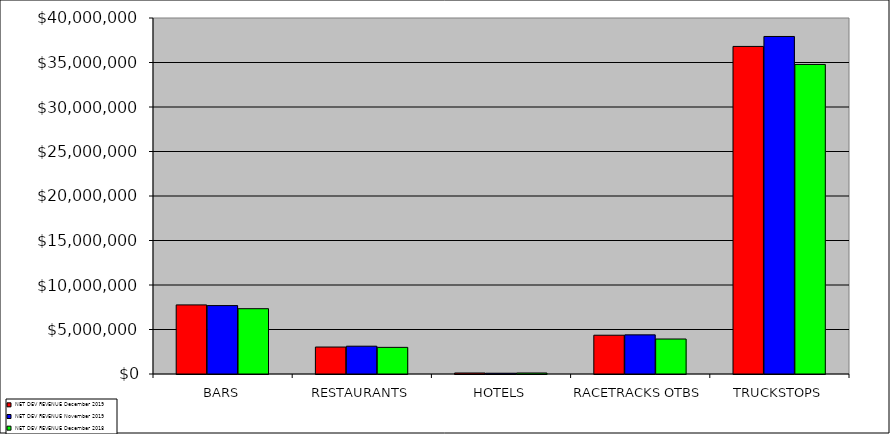
| Category | NET DEV REVENUE |
|---|---|
| BARS | 7338151 |
| RESTAURANTS | 2991907 |
| HOTELS | 115447 |
| RACETRACKS OTBS | 3931215 |
| TRUCKSTOPS | 34781438 |